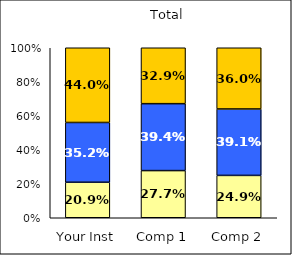
| Category | Low Satisfaction with Coursework | Average Satisfaction with Coursework | High Satisfaction with Coursework |
|---|---|---|---|
| Your Inst | 0.209 | 0.352 | 0.44 |
| Comp 1 | 0.277 | 0.394 | 0.329 |
| Comp 2 | 0.249 | 0.391 | 0.36 |